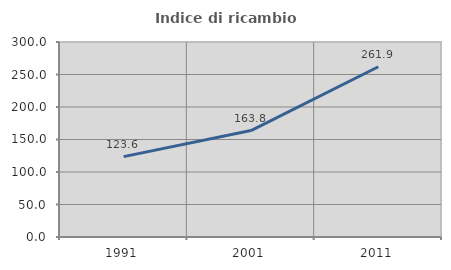
| Category | Indice di ricambio occupazionale  |
|---|---|
| 1991.0 | 123.636 |
| 2001.0 | 163.78 |
| 2011.0 | 261.885 |